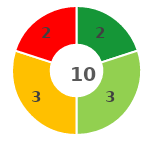
| Category | Series 0 |
|---|---|
| 0 | 2 |
| 1 | 3 |
| 2 | 3 |
| 3 | 2 |
| 4 | 0 |